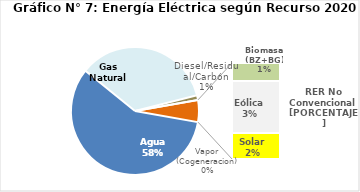
| Category | Series 0 |
|---|---|
| Agua | 2845.429 |
| Gas Natural | 1723.518 |
| Diesel/Residual/Carbón | 57.697 |
| Vapor (Cogeneracion) | 0.259 |
| Biomasa (BZ+BG) | 51.329 |
| Eólica | 147.328 |
| Solar | 73.657 |